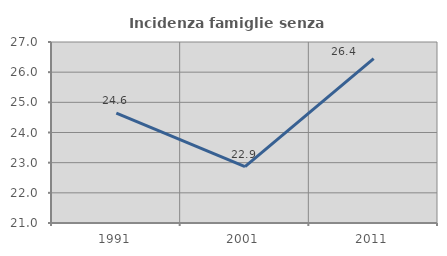
| Category | Incidenza famiglie senza nuclei |
|---|---|
| 1991.0 | 24.645 |
| 2001.0 | 22.87 |
| 2011.0 | 26.448 |